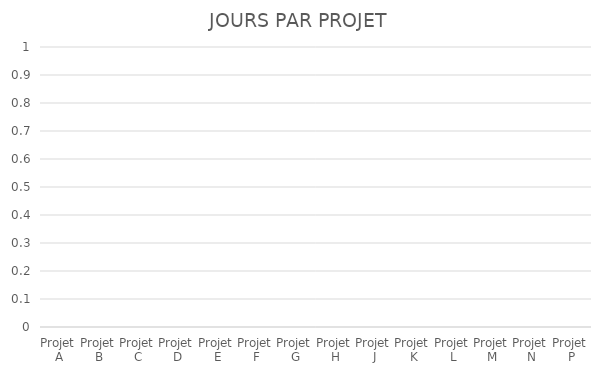
| Category | NB DE JOURS |
|---|---|
| Projet A | 0 |
| Projet B | 0 |
| Projet C | 0 |
| Projet D | 0 |
| Projet E | 0 |
| Projet F | 0 |
| Projet G | 0 |
| Projet H | 0 |
| Projet J | 0 |
| Projet K | 0 |
| Projet L | 0 |
| Projet M | 0 |
| Projet N | 0 |
| Projet P | 0 |